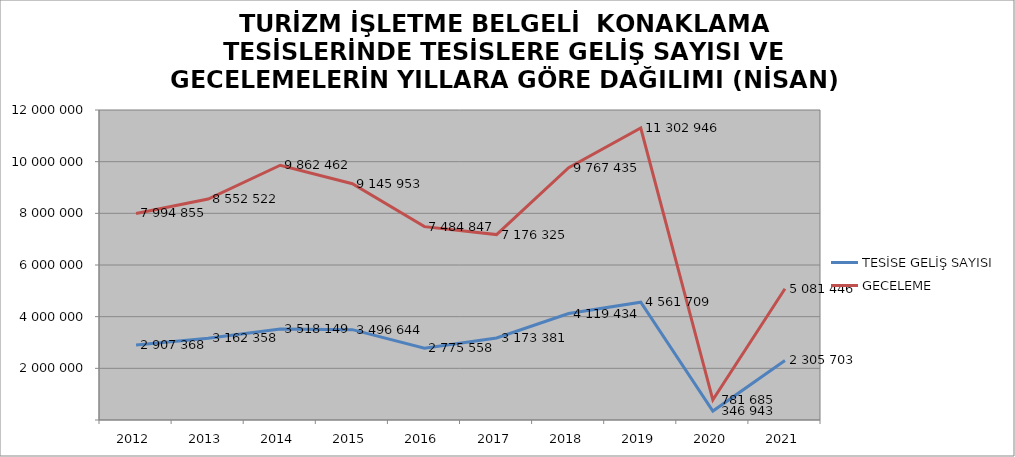
| Category | TESİSE GELİŞ SAYISI | GECELEME |
|---|---|---|
| 2012 | 2907368 | 7994855 |
| 2013 | 3162358 | 8552522 |
| 2014 | 3518149 | 9862462 |
| 2015 | 3496644 | 9145953 |
| 2016 | 2775558 | 7484847 |
| 2017 | 3173381 | 7176325 |
| 2018 | 4119434 | 9767435 |
| 2019 | 4561709 | 11302946 |
| 2020 | 346943 | 781685 |
| 2021 | 2305703 | 5081446 |